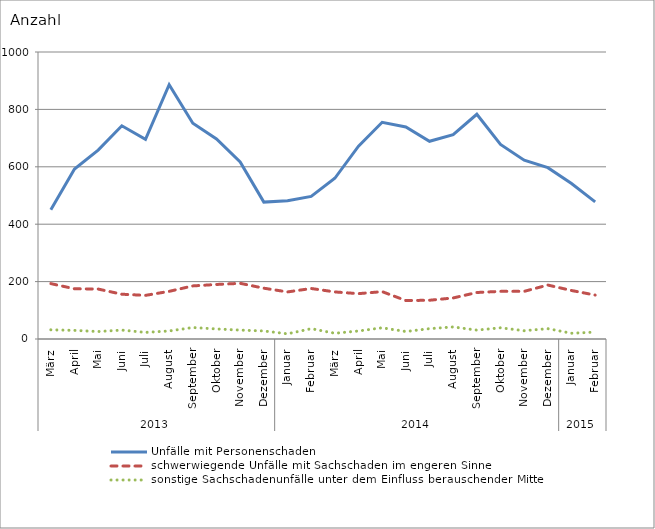
| Category | Unfälle mit Personenschaden | schwerwiegende Unfälle mit Sachschaden im engeren Sinne | sonstige Sachschadenunfälle unter dem Einfluss berauschender Mittel |
|---|---|---|---|
| 0 | 450 | 193 | 32 |
| 1 | 592 | 175 | 30 |
| 2 | 658 | 174 | 26 |
| 3 | 743 | 156 | 31 |
| 4 | 696 | 152 | 23 |
| 5 | 886 | 166 | 28 |
| 6 | 752 | 185 | 40 |
| 7 | 697 | 190 | 35 |
| 8 | 617 | 194 | 31 |
| 9 | 477 | 177 | 28 |
| 10 | 482 | 164 | 18 |
| 11 | 497 | 176 | 36 |
| 12 | 560 | 164 | 20 |
| 13 | 672 | 158 | 28 |
| 14 | 755 | 165 | 39 |
| 15 | 739 | 134 | 26 |
| 16 | 689 | 135 | 36 |
| 17 | 712 | 143 | 42 |
| 18 | 783 | 162 | 31 |
| 19 | 678 | 166 | 39 |
| 20 | 623 | 166 | 29 |
| 21 | 597 | 188 | 36 |
| 22 | 542 | 169 | 20 |
| 23 | 478 | 153 | 24 |